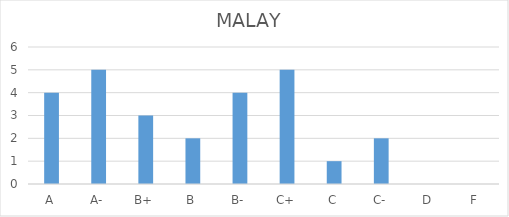
| Category | MALAY  |
|---|---|
| A | 4 |
| A- | 5 |
| B+ | 3 |
| B | 2 |
| B- | 4 |
| C+ | 5 |
| C | 1 |
| C- | 2 |
| D | 0 |
| F | 0 |